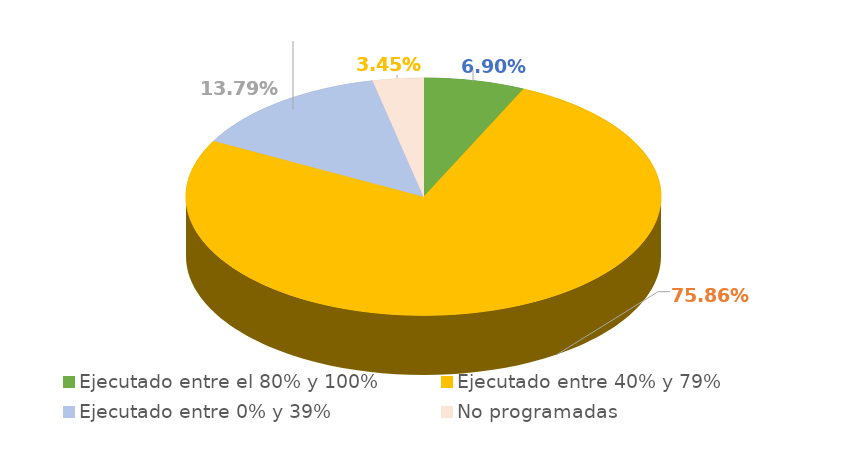
| Category | Series 0 |
|---|---|
| Ejecutado entre el 80% y 100% | 0.069 |
| Ejecutado entre 40% y 79% | 0.759 |
| Ejecutado entre 0% y 39% | 0.138 |
| No programadas | 0.034 |